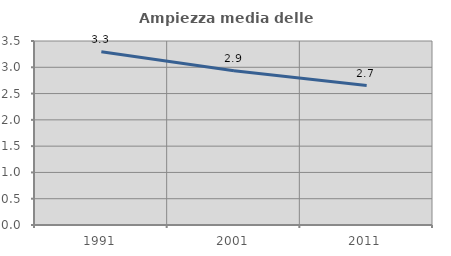
| Category | Ampiezza media delle famiglie |
|---|---|
| 1991.0 | 3.297 |
| 2001.0 | 2.933 |
| 2011.0 | 2.653 |